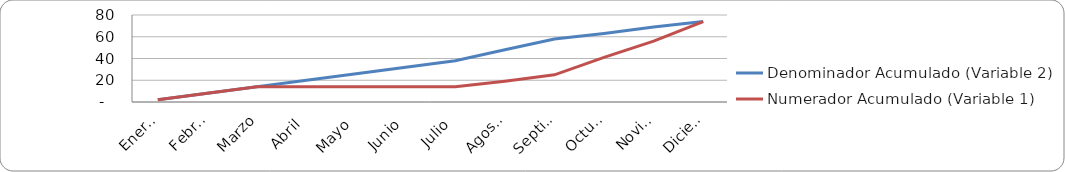
| Category | Denominador Acumulado (Variable 2) | Numerador Acumulado (Variable 1) |
|---|---|---|
| Enero  | 2 | 2 |
| Febrero | 8 | 8 |
| Marzo | 14 | 14 |
| Abril | 20 | 14 |
| Mayo | 26 | 14 |
| Junio | 32 | 14 |
| Julio | 38 | 14 |
| Agosto | 48 | 19 |
| Septiembre | 58 | 25 |
| Octubre | 63 | 41 |
| Noviembre | 69 | 56 |
| Diciembre | 74 | 74 |